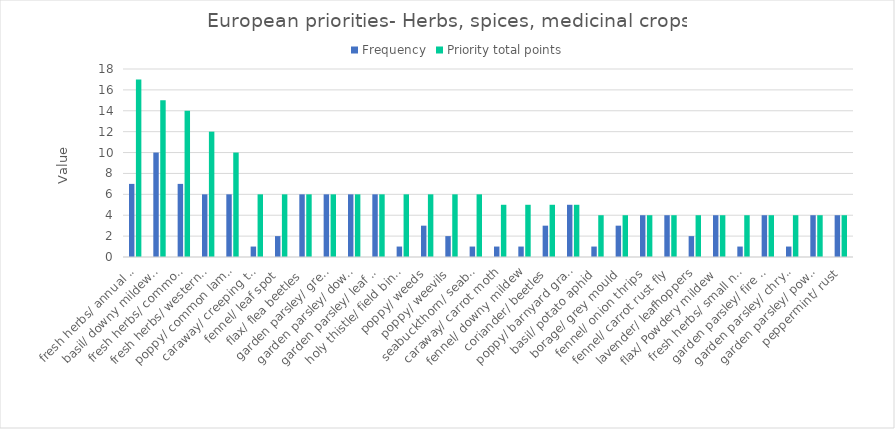
| Category | Frequency | Priority total points |
|---|---|---|
| fresh herbs/ annual meadow grass | 7 | 17 |
| basil/ downy mildew of basil | 10 | 15 |
| fresh herbs/ common groundsel | 7 | 14 |
| fresh herbs/ western flower thrips | 6 | 12 |
| poppy/ common lambsquarters | 6 | 10 |
| caraway/ creeping thistle | 1 | 6 |
| fennel/ leaf spot | 2 | 6 |
| flax/ flea beetles | 6 | 6 |
| garden parsley/ green peach aphid | 6 | 6 |
| garden parsley/ downy mildew | 6 | 6 |
| garden parsley/ leaf blight of parsley | 6 | 6 |
| holy thistle/ field bindweed | 1 | 6 |
| poppy/ weeds | 3 | 6 |
| poppy/ weevils | 2 | 6 |
| seabuckthorn/ seabuckthorn fruit fly | 1 | 6 |
| caraway/ carrot moth | 1 | 5 |
| fennel/ downy mildew | 1 | 5 |
| coriander/ beetles | 3 | 5 |
| poppy/ barnyard grass | 5 | 5 |
| basil/ potato aphid | 1 | 4 |
| borage/ grey mould | 3 | 4 |
| fennel/ onion thrips | 4 | 4 |
| fennel/ carrot rust fly | 4 | 4 |
| lavender/ leafhoppers | 2 | 4 |
| flax/ Powdery mildew | 4 | 4 |
| fresh herbs/ small nettle | 1 | 4 |
| garden parsley/ fire blight of celery | 4 | 4 |
| garden parsley/ chrysanthemum leaf miner | 1 | 4 |
| garden parsley/ powdery mildew of parsley | 4 | 4 |
| peppermint/ rust | 4 | 4 |